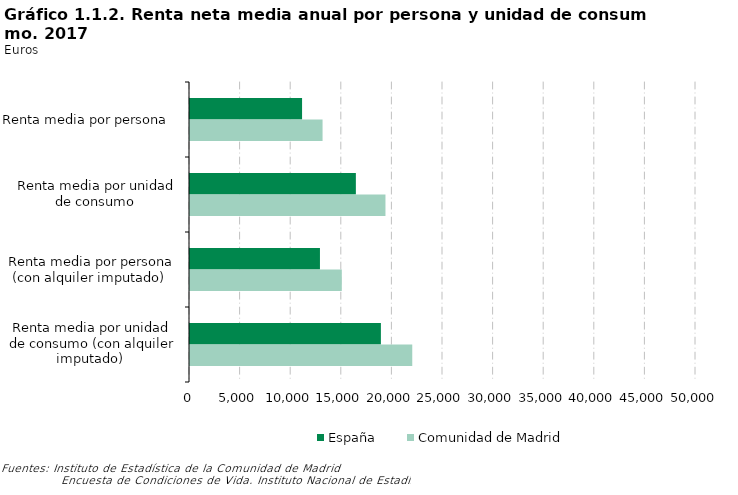
| Category | España | Comunidad de Madrid |
|---|---|---|
| Renta media por persona  | 11074 | 13099 |
| Renta media por unidad de consumo  | 16390 | 19314 |
| Renta media por persona (con alquiler imputado)  | 12841 | 15000 |
| Renta media por unidad de consumo (con alquiler imputado)  | 18863 | 21962 |